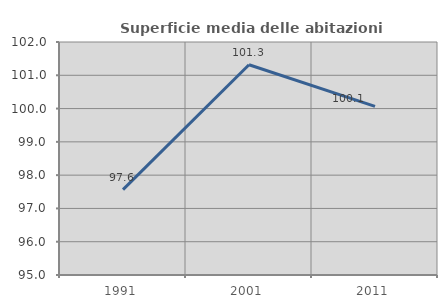
| Category | Superficie media delle abitazioni occupate |
|---|---|
| 1991.0 | 97.564 |
| 2001.0 | 101.318 |
| 2011.0 | 100.066 |